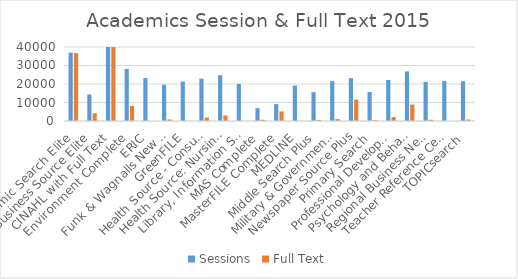
| Category | Sessions | Full Text |
|---|---|---|
| Academic Search Elite | 36968 | 36688 |
| Business Source Elite | 14383 | 4142 |
| CINAHL with Full Text | 41089 | 42643 |
| Environment Complete | 28214 | 8146 |
| ERIC | 23213 | 0 |
| Funk & Wagnalls New World Encyclopedia | 19610 | 848 |
| GreenFILE | 21303 | 31 |
| Health Source - Consumer Edition | 22917 | 1859 |
| Health Source: Nursing/Academic Edition | 24720 | 2998 |
| Library, Information Science & Technology Abstracts | 20028 | 0 |
| MAS Complete | 6967 | 661 |
| MasterFILE Complete | 9145 | 5204 |
| MEDLINE | 19181 | 0 |
| Middle Search Plus | 15618 | 592 |
| Military & Government Collection | 21579 | 1024 |
| Newspaper Source Plus | 23148 | 11548 |
| Primary Search | 15686 | 485 |
| Professional Development Collection | 22189 | 2092 |
| Psychology and Behavioral Sciences Collection | 26809 | 8897 |
| Regional Business News | 21195 | 680 |
| Teacher Reference Center | 21602 | 0 |
| TOPICsearch | 21457 | 806 |